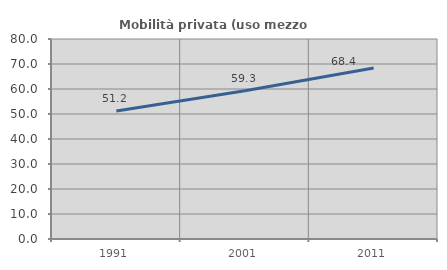
| Category | Mobilità privata (uso mezzo privato) |
|---|---|
| 1991.0 | 51.163 |
| 2001.0 | 59.274 |
| 2011.0 | 68.359 |